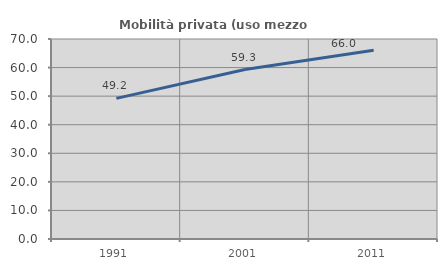
| Category | Mobilità privata (uso mezzo privato) |
|---|---|
| 1991.0 | 49.209 |
| 2001.0 | 59.32 |
| 2011.0 | 66.025 |